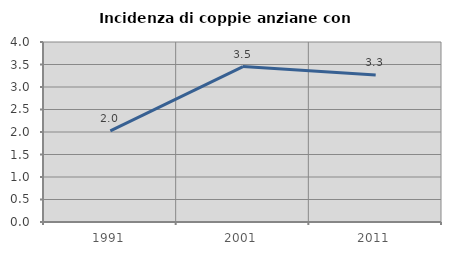
| Category | Incidenza di coppie anziane con figli |
|---|---|
| 1991.0 | 2.026 |
| 2001.0 | 3.453 |
| 2011.0 | 3.268 |